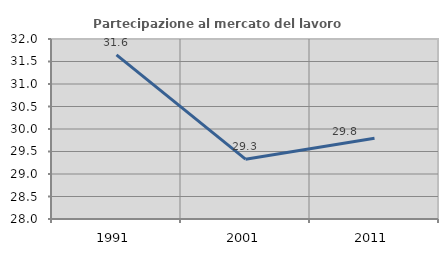
| Category | Partecipazione al mercato del lavoro  femminile |
|---|---|
| 1991.0 | 31.646 |
| 2001.0 | 29.33 |
| 2011.0 | 29.795 |